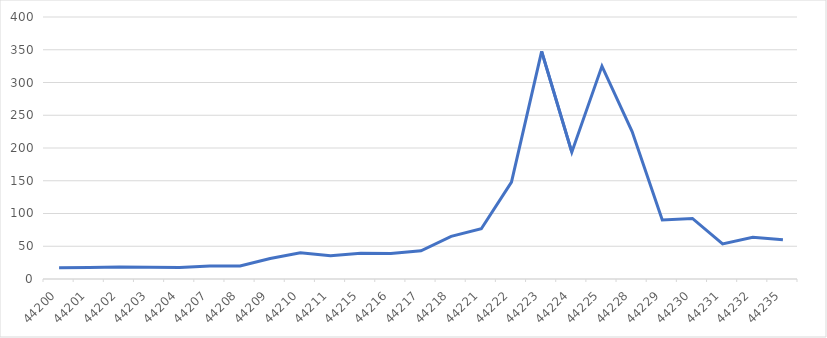
| Category | Close |
|---|---|
| 1/4/21 | 17.25 |
| 1/5/21 | 17.37 |
| 1/6/21 | 18.36 |
| 1/7/21 | 18.08 |
| 1/8/21 | 17.69 |
| 1/11/21 | 19.94 |
| 1/12/21 | 19.95 |
| 1/13/21 | 31.4 |
| 1/14/21 | 39.91 |
| 1/15/21 | 35.5 |
| 1/19/21 | 39.36 |
| 1/20/21 | 39.12 |
| 1/21/21 | 43.03 |
| 1/22/21 | 65.01 |
| 1/25/21 | 76.79 |
| 1/26/21 | 147.98 |
| 1/27/21 | 347.51 |
| 1/28/21 | 193.6 |
| 1/29/21 | 325 |
| 2/1/21 | 225 |
| 2/2/21 | 90 |
| 2/3/21 | 92.41 |
| 2/4/21 | 53.5 |
| 2/5/21 | 63.77 |
| 2/8/21 | 60 |